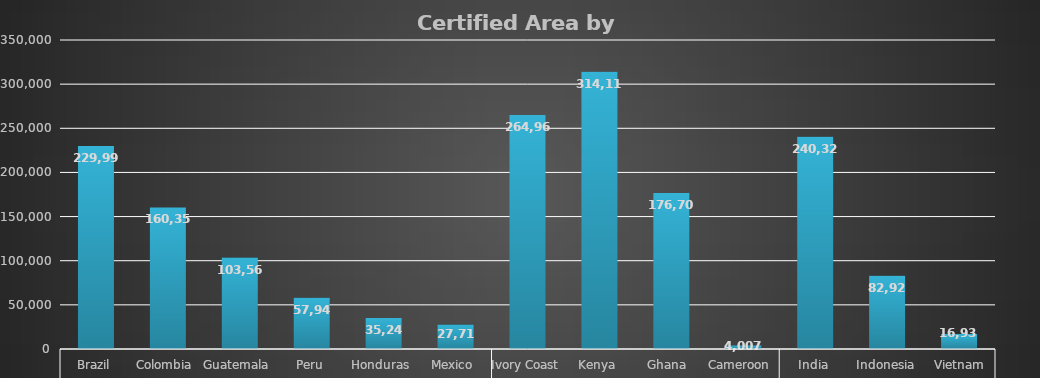
| Category | Feb-22 |
|---|---|
| 0 | 229989.62 |
| 1 | 160357.55 |
| 2 | 103568.67 |
| 3 | 57941.37 |
| 4 | 35249.28 |
| 5 | 27718.96 |
| 6 | 264964.13 |
| 7 | 314115.07 |
| 8 | 176708.31 |
| 9 | 4007.12 |
| 10 | 240327.27 |
| 11 | 82928.42 |
| 12 | 16936.11 |